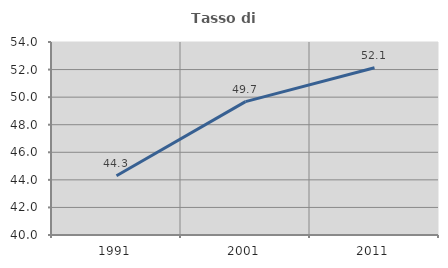
| Category | Tasso di occupazione   |
|---|---|
| 1991.0 | 44.3 |
| 2001.0 | 49.677 |
| 2011.0 | 52.128 |